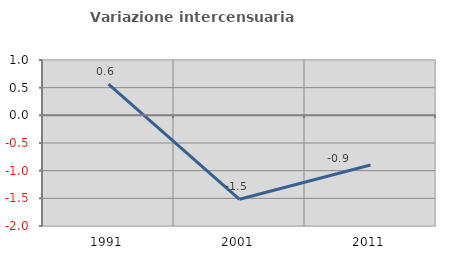
| Category | Variazione intercensuaria annua |
|---|---|
| 1991.0 | 0.566 |
| 2001.0 | -1.517 |
| 2011.0 | -0.899 |